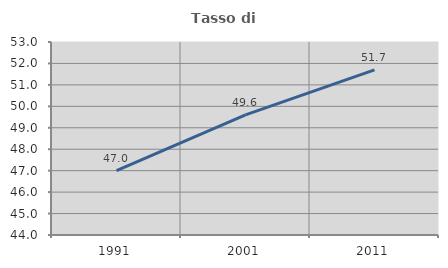
| Category | Tasso di occupazione   |
|---|---|
| 1991.0 | 46.997 |
| 2001.0 | 49.6 |
| 2011.0 | 51.696 |